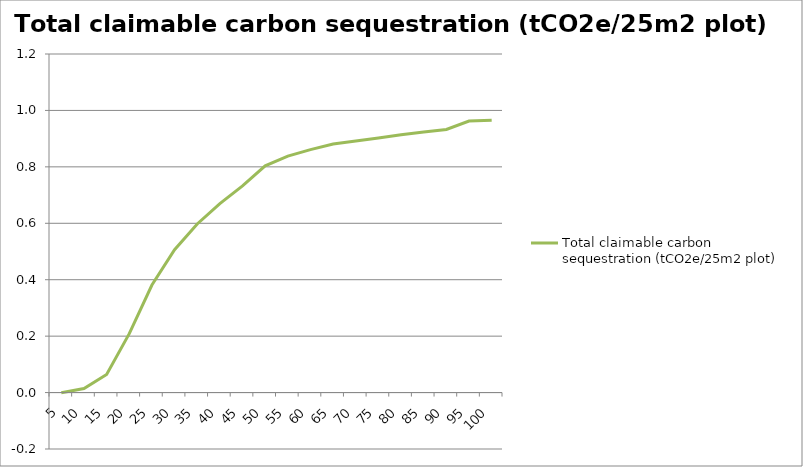
| Category | Total claimable carbon sequestration (tCO2e/25m2 plot) |
|---|---|
| 5.0 | -0.001 |
| 10.0 | 0.014 |
| 15.0 | 0.064 |
| 20.0 | 0.209 |
| 25.0 | 0.381 |
| 30.0 | 0.506 |
| 35.0 | 0.598 |
| 40.0 | 0.67 |
| 45.0 | 0.732 |
| 50.0 | 0.804 |
| 55.0 | 0.838 |
| 60.0 | 0.861 |
| 65.0 | 0.881 |
| 70.0 | 0.891 |
| 75.0 | 0.902 |
| 80.0 | 0.914 |
| 85.0 | 0.924 |
| 90.0 | 0.932 |
| 95.0 | 0.962 |
| 100.0 | 0.966 |